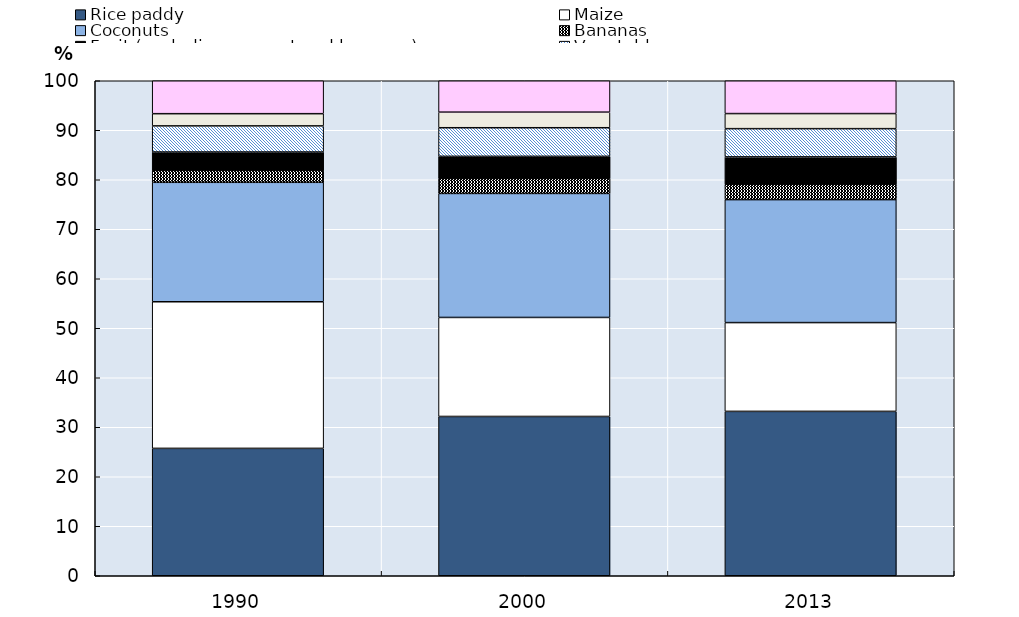
| Category | Rice paddy | Maize | Coconuts | Bananas | Fruit (excluding coconut and bananas) | Vegetables | Sugar cane | Other |
|---|---|---|---|---|---|---|---|---|
| 1990.0 | 25.735 | 29.618 | 24.131 | 2.418 | 3.702 | 5.274 | 2.469 | 6.652 |
| 2000.0 | 32.179 | 20.004 | 25.053 | 3.048 | 4.446 | 5.781 | 3.147 | 6.342 |
| 2013.0 | 33.207 | 17.937 | 24.842 | 3.12 | 5.514 | 5.703 | 3.046 | 6.63 |